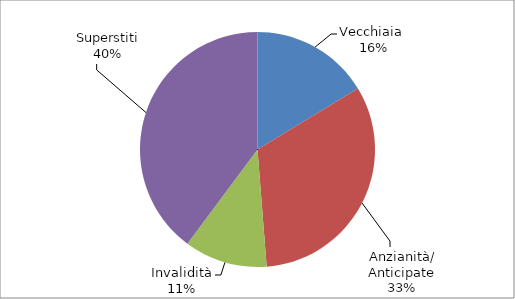
| Category | Series 0 |
|---|---|
| Vecchiaia  | 10224 |
| Anzianità/ Anticipate | 20342 |
| Invalidità | 7165 |
| Superstiti | 24962 |